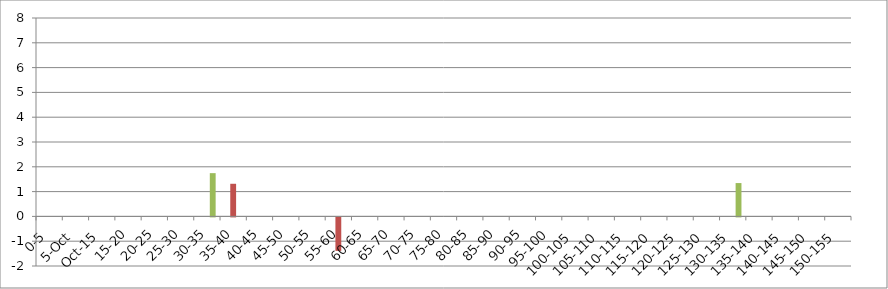
| Category | 119875 | 146067 | 241240 |
|---|---|---|---|
| 0-5 | 0 | 0 | 0 |
| 5-Oct | 0 | 0 | 0 |
| Oct-15 | 0 | 0 | 0 |
| 15-20 | 0 | 0 | 0 |
| 20-25 | 0 | 0 | 0 |
| 25-30 | 0 | 0 | 0 |
| 30-35 | 0 | 0 | 1.744 |
| 35-40 | 0 | 1.316 | 0 |
| 40-45 | 0 | 0 | 0 |
| 45-50 | 0 | 0 | 0 |
| 50-55 | 0 | 0 | 0 |
| 55-60 | 0 | -1.351 | 0 |
| 60-65 | 0 | 0 | 0 |
| 65-70 | 0 | 0 | 0 |
| 70-75 | 0 | 0 | 0 |
| 75-80 | 0 | 0 | 0 |
| 80-85 | 0 | 0 | 0 |
| 85-90 | 0 | 0 | 0 |
| 90-95 | 0 | 0 | 0 |
| 95-100 | 0 | 0 | 0 |
| 100-105 | 0 | 0 | 0 |
| 105-110 | 0 | 0 | 0 |
| 110-115 | 0 | 0 | 0 |
| 115-120 | 0 | 0 | 0 |
| 120-125 | 0 | 0 | 0 |
| 125-130 | 0 | 0 | 0 |
| 130-135 | 0 | 0 | 1.344 |
| 135-140 | 0 | 0 | 0 |
| 140-145 | 0 | 0 | 0 |
| 145-150 | 0 | 0 | 0 |
| 150-155 | 0 | 0 | 0 |